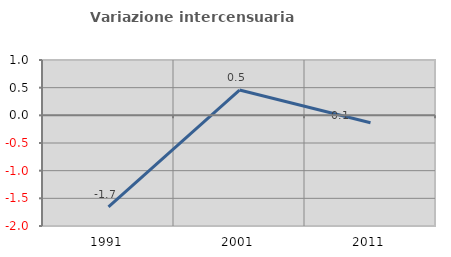
| Category | Variazione intercensuaria annua |
|---|---|
| 1991.0 | -1.653 |
| 2001.0 | 0.457 |
| 2011.0 | -0.133 |